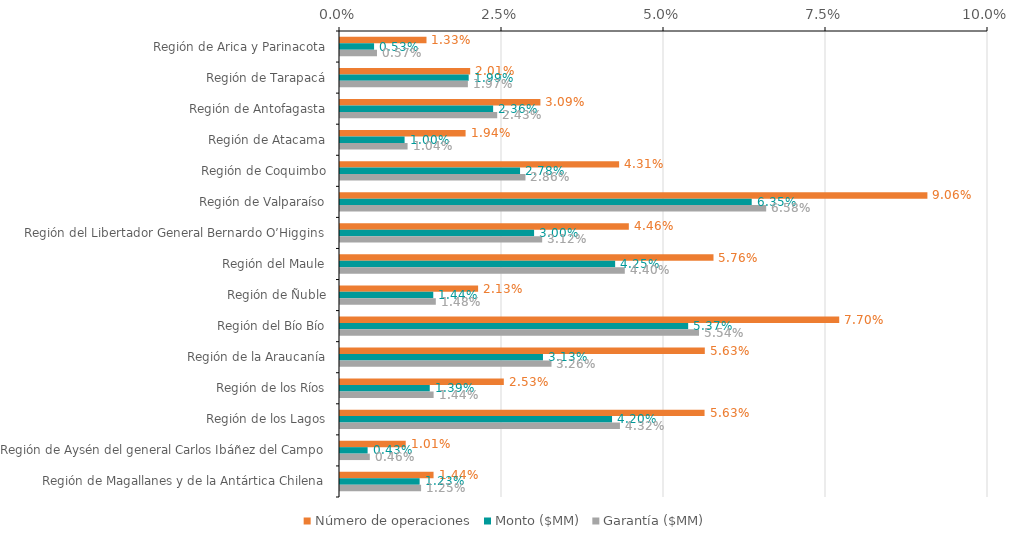
| Category | Número de operaciones | Monto ($MM) | Garantía ($MM) |
|---|---|---|---|
| Región de Arica y Parinacota | 0.013 | 0.005 | 0.006 |
| Región de Tarapacá | 0.02 | 0.02 | 0.02 |
| Región de Antofagasta | 0.031 | 0.024 | 0.024 |
| Región de Atacama | 0.019 | 0.01 | 0.01 |
| Región de Coquimbo | 0.043 | 0.028 | 0.029 |
| Región de Valparaíso | 0.091 | 0.064 | 0.066 |
| Región del Libertador General Bernardo O’Higgins | 0.045 | 0.03 | 0.031 |
| Región del Maule | 0.058 | 0.042 | 0.044 |
| Región de Ñuble | 0.021 | 0.014 | 0.015 |
| Región del Bío Bío | 0.077 | 0.054 | 0.055 |
| Región de la Araucanía | 0.056 | 0.031 | 0.033 |
| Región de los Ríos | 0.025 | 0.014 | 0.014 |
| Región de los Lagos | 0.056 | 0.042 | 0.043 |
| Región de Aysén del general Carlos Ibáñez del Campo | 0.01 | 0.004 | 0.005 |
| Región de Magallanes y de la Antártica Chilena | 0.014 | 0.012 | 0.013 |